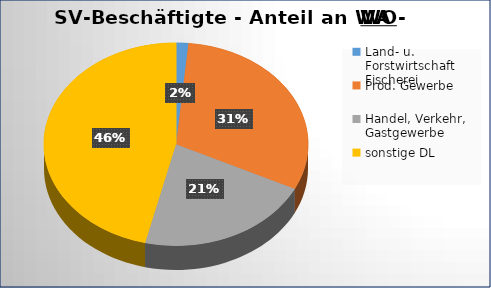
| Category | Series 0 |
|---|---|
| Land- u. Forstwirtschaft  Fischerei | 1077 |
| Prod. Gewerbe | 22047 |
| Handel, Verkehr, Gastgewerbe | 15404 |
| sonstige DL | 33163 |